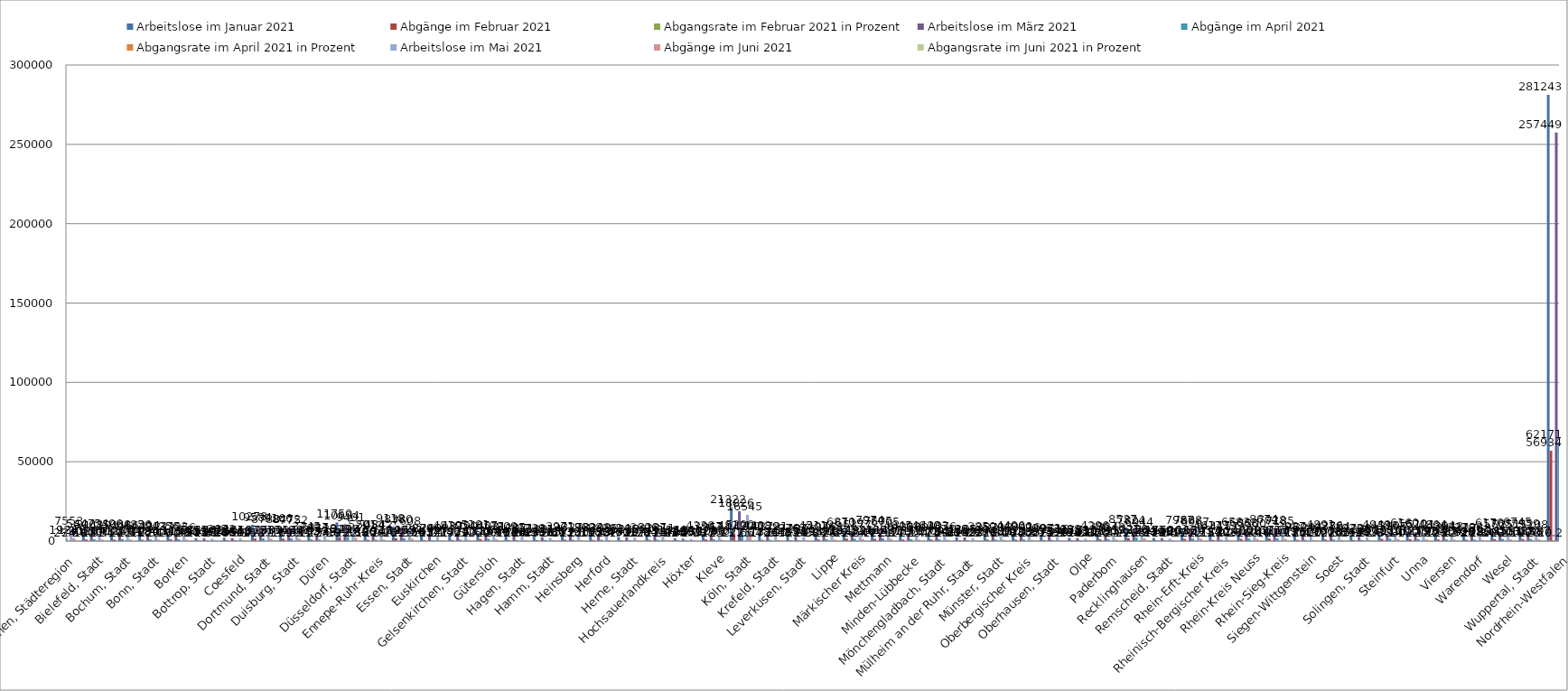
| Category | Arbeitslose im Januar 2021 | Abgänge im Februar 2021 | Abgangsrate im Februar 2021 in Prozent | Arbeitslose im März 2021 | Abgänge im April 2021 | Abgangsrate im April 2021 in Prozent | Arbeitslose im Mai 2021 | Abgänge im Juni 2021 | Abgangsrate im Juni 2021 in Prozent |
|---|---|---|---|---|---|---|---|---|---|
| Aachen, Städteregion | 8768 | 1762 | 20.1 | 8259 | 1924 | 23.3 | 7553 | 1839 | 24.3 |
| Bielefeld, Stadt | 5447 | 1030 | 18.9 | 5068 | 1204 | 23.8 | 4419 | 950 | 21.5 |
| Bochum, Stadt | 5496 | 935 | 17 | 5068 | 1240 | 24.5 | 4466 | 1004 | 22.5 |
| Bonn, Stadt | 4856 | 818 | 16.8 | 4494 | 994 | 22.1 | 4122 | 860 | 20.9 |
| Borken | 4256 | 1118 | 26.3 | 3753 | 1134 | 30.2 | 3256 | 893 | 27.4 |
| Bottrop, Stadt | 1811 | 315 | 17.4 | 1686 | 357 | 21.2 | 1448 | 295 | 20.4 |
| Coesfeld | 2072 | 586 | 28.3 | 1881 | 664 | 35.3 | 1663 | 565 | 34 |
| Dortmund, Stadt | 10278 | 1613 | 15.7 | 9584 | 1733 | 18.1 | 8788 | 1500 | 17.1 |
| Duisburg, Stadt | 9166 | 1549 | 16.9 | 8472 | 1634 | 19.3 | 7752 | 1482 | 19.1 |
| Düren | 3745 | 962 | 25.7 | 3427 | 933 | 27.2 | 3119 | 775 | 24.8 |
| Düsseldorf, Stadt | 11750 | 2321 | 19.8 | 10634 | 2498 | 23.5 | 9401 | 2142 | 22.8 |
| Ennepe-Ruhr-Kreis | 5201 | 826 | 15.9 | 5054 | 903 | 17.9 | 4842 | 947 | 19.6 |
| Essen, Stadt | 9118 | 1842 | 20.2 | 8380 | 1902 | 22.7 | 7608 | 1591 | 20.9 |
| Euskirchen | 2874 | 553 | 19.2 | 2796 | 617 | 22.1 | 2600 | 547 | 21 |
| Gelsenkirchen, Stadt | 4810 | 746 | 15.5 | 4395 | 924 | 21 | 3790 | 757 | 20 |
| Gütersloh | 5181 | 1313 | 25.3 | 4657 | 1364 | 29.3 | 4031 | 1094 | 27.1 |
| Hagen, Stadt | 3809 | 603 | 15.8 | 3485 | 641 | 18.4 | 3071 | 642 | 20.9 |
| Hamm, Stadt | 2739 | 639 | 23.3 | 2411 | 761 | 31.6 | 2014 | 565 | 28.1 |
| Heinsberg | 3971 | 853 | 21.5 | 3619 | 819 | 22.6 | 3278 | 736 | 22.5 |
| Herford | 3698 | 718 | 19.4 | 3348 | 852 | 25.4 | 2988 | 707 | 23.7 |
| Herne, Stadt | 2614 | 460 | 17.6 | 2435 | 512 | 21 | 2222 | 507 | 22.8 |
| Hochsauerlandkreis | 3606 | 764 | 21.2 | 3137 | 853 | 27.2 | 2811 | 737 | 26.2 |
| Höxter | 1684 | 416 | 24.7 | 1484 | 456 | 30.7 | 1287 | 351 | 27.3 |
| Kleve | 4336 | 1028 | 23.7 | 3947 | 1068 | 27.1 | 3574 | 906 | 25.3 |
| Köln, Stadt | 21322 | 4812 | 22.6 | 18826 | 5200 | 27.6 | 16545 | 4202 | 25.4 |
| Krefeld, Stadt | 4408 | 778 | 17.6 | 4129 | 824 | 20 | 3721 | 711 | 19.1 |
| Leverkusen, Stadt | 2976 | 485 | 16.3 | 2707 | 574 | 21.2 | 2506 | 483 | 19.3 |
| Lippe | 4511 | 1039 | 23 | 4076 | 1126 | 27.6 | 3462 | 918 | 26.5 |
| Märkischer Kreis | 6870 | 1522 | 22.2 | 6119 | 1494 | 24.4 | 5377 | 1326 | 24.7 |
| Mettmann | 7974 | 1425 | 17.9 | 7505 | 1699 | 22.6 | 6705 | 1437 | 21.4 |
| Minden-Lübbecke | 4645 | 979 | 21.1 | 4208 | 1153 | 27.4 | 3560 | 915 | 25.7 |
| Mönchengladbach, Stadt | 4640 | 973 | 21 | 4383 | 1091 | 24.9 | 4076 | 841 | 20.6 |
| Mülheim an der Ruhr, Stadt | 2439 | 516 | 21.2 | 2255 | 592 | 26.3 | 1963 | 452 | 23 |
| Münster, Stadt | 3850 | 896 | 23.3 | 3570 | 943 | 26.4 | 3318 | 807 | 24.3 |
| Oberbergischer Kreis | 4496 | 912 | 20.3 | 4000 | 1012 | 25.3 | 3416 | 783 | 22.9 |
| Oberhausen, Stadt | 3095 | 655 | 21.2 | 2971 | 745 | 25.1 | 2518 | 570 | 22.6 |
| Olpe | 2038 | 432 | 21.2 | 1783 | 442 | 24.8 | 1516 | 351 | 23.2 |
| Paderborn | 4296 | 1087 | 25.3 | 3867 | 1125 | 29.1 | 3248 | 907 | 27.9 |
| Recklinghausen | 8537 | 1931 | 22.6 | 7824 | 2250 | 28.8 | 6944 | 1764 | 25.4 |
| Remscheid, Stadt | 1931 | 339 | 17.6 | 1779 | 365 | 20.5 | 1506 | 369 | 24.5 |
| Rhein-Erft-Kreis | 7987 | 1387 | 17.4 | 7688 | 1630 | 21.2 | 6967 | 1543 | 22.1 |
| Rheinisch-Bergischer Kreis | 4617 | 734 | 15.9 | 4347 | 790 | 18.2 | 4157 | 728 | 17.5 |
| Rhein-Kreis Neuss | 6583 | 1400 | 21.3 | 6068 | 1600 | 26.4 | 5500 | 1287 | 23.4 |
| Rhein-Sieg-Kreis | 8674 | 1615 | 18.6 | 7928 | 1717 | 21.7 | 7185 | 1369 | 19.1 |
| Siegen-Wittgenstein | 3987 | 735 | 18.4 | 3594 | 767 | 21.3 | 3294 | 660 | 20 |
| Soest | 4891 | 961 | 19.6 | 4286 | 968 | 22.6 | 3784 | 781 | 20.6 |
| Solingen, Stadt | 3023 | 649 | 21.5 | 2700 | 649 | 24 | 2382 | 539 | 22.6 |
| Steinfurt | 4949 | 1390 | 28.1 | 4516 | 1510 | 33.4 | 3905 | 1170 | 30 |
| Unna | 6160 | 1175 | 19.1 | 5620 | 1279 | 22.8 | 5121 | 1033 | 20.2 |
| Viersen | 4864 | 954 | 19.6 | 4364 | 1025 | 23.5 | 3948 | 904 | 22.9 |
| Warendorf | 3279 | 820 | 25 | 3138 | 921 | 29.3 | 2768 | 786 | 28.4 |
| Wesel | 6170 | 1245 | 20.2 | 5765 | 1355 | 23.5 | 5251 | 1091 | 20.8 |
| Wuppertal, Stadt | 6745 | 1318 | 19.5 | 5959 | 1338 | 22.5 | 5208 | 1087 | 20.9 |
| Nordrhein-Westfalen | 281243 | 56934 | 20.2 | 257449 | 62171 | 24.1 | 229954 | 52206 | 22.7 |